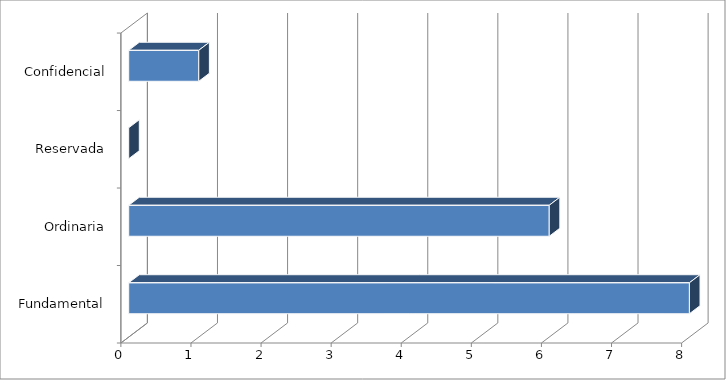
| Category | Series 0 |
|---|---|
| 0 | 8 |
| 1 | 6 |
| 2 | 0 |
| 3 | 1 |